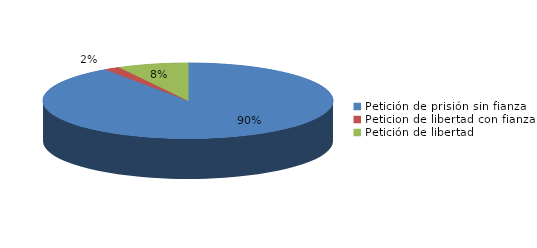
| Category | Series 0 |
|---|---|
| Petición de prisión sin fianza | 722 |
| Peticion de libertad con fianza | 14 |
| Petición de libertad | 63 |